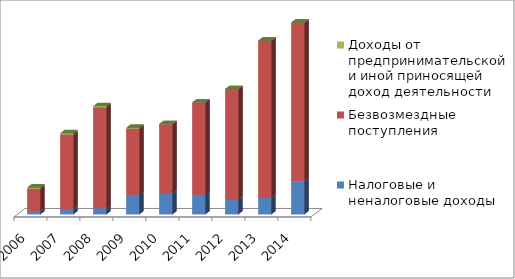
| Category | Налоговые и неналоговые доходы | Безвозмездные поступления | Доходы от предпринимательской и иной приносящей доход деятельности |
|---|---|---|---|
| 2006.0 | 530.26 | 3408.14 | 203.1 |
| 2007.0 | 836.3 | 11408.8 | 225.7 |
| 2008.0 | 932 | 15526.08 | 171 |
| 2009.0 | 3014.96 | 10146.75 | 164.99 |
| 2010.0 | 3183.693 | 10675.088 | 0 |
| 2011.0 | 3034.772 | 14142.092 | 0 |
| 2012.0 | 2255.471 | 16990.443 | 0 |
| 2013.0 | 2566.966 | 24090.331 | 0 |
| 2014.0 | 5117.251 | 24320.692 | 0 |